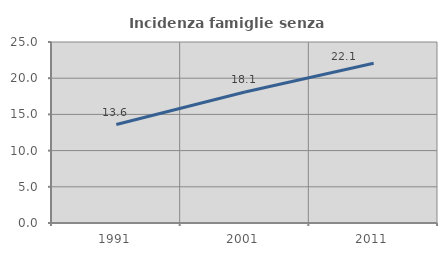
| Category | Incidenza famiglie senza nuclei |
|---|---|
| 1991.0 | 13.6 |
| 2001.0 | 18.085 |
| 2011.0 | 22.075 |